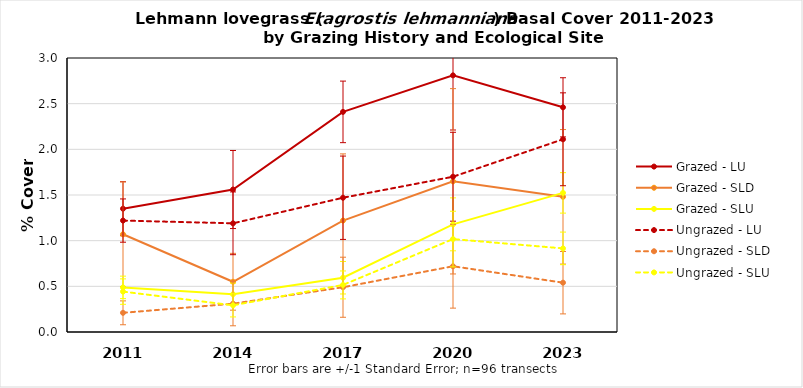
| Category | Grazed - LU | Grazed - SLD | Grazed - SLU | Ungrazed - LU | Ungrazed - SLD | Ungrazed - SLU |
|---|---|---|---|---|---|---|
| 2011.0 | 1.35 | 1.07 | 0.488 | 1.22 | 0.21 | 0.442 |
| 2014.0 | 1.56 | 0.55 | 0.413 | 1.19 | 0.31 | 0.292 |
| 2017.0 | 2.41 | 1.22 | 0.594 | 1.47 | 0.49 | 0.515 |
| 2020.0 | 2.81 | 1.65 | 1.179 | 1.7 | 0.72 | 1.017 |
| 2023.0 | 2.46 | 1.48 | 1.523 | 2.11 | 0.54 | 0.915 |